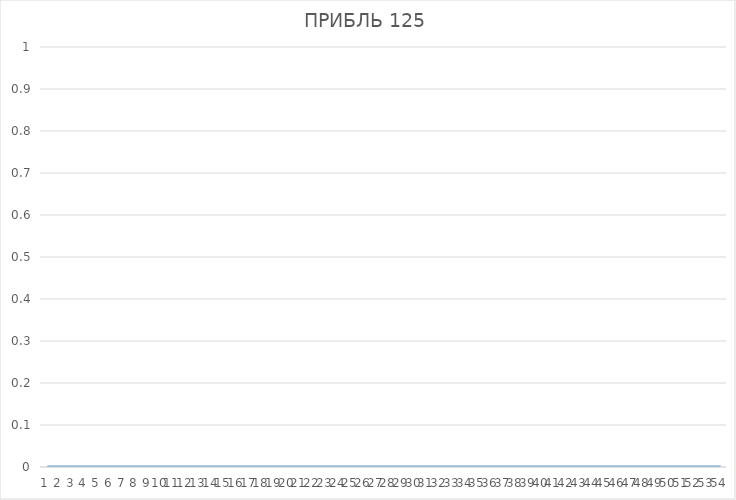
| Category | ПРИБЛЬ |
|---|---|
| 0 | 125 |
| 1 | 126 |
| 2 | 127 |
| 3 | 128 |
| 4 | 129 |
| 5 | 130 |
| 6 | 131 |
| 7 | 132 |
| 8 | 133 |
| 9 | 134 |
| 10 | 135 |
| 11 | 300 |
| 12 | 137 |
| 13 | 138 |
| 14 | 139 |
| 15 | 140 |
| 16 | 141 |
| 17 | 142 |
| 18 | 143 |
| 19 | 144 |
| 20 | 145 |
| 21 | 146 |
| 22 | 147 |
| 23 | 148 |
| 24 | 149 |
| 25 | 150 |
| 26 | 151 |
| 27 | 152 |
| 28 | 153 |
| 29 | 154 |
| 30 | 155 |
| 31 | 156 |
| 32 | 157 |
| 33 | 158 |
| 34 | 159 |
| 35 | 160 |
| 36 | 161 |
| 37 | 162 |
| 38 | 163 |
| 39 | 164 |
| 40 | 165 |
| 41 | 166 |
| 42 | 500 |
| 43 | 168 |
| 44 | 169 |
| 45 | 170 |
| 46 | 171 |
| 47 | 172 |
| 48 | 173 |
| 49 | 174 |
| 50 | 175 |
| 51 | 176 |
| 52 | 177 |
| 53 | 178 |